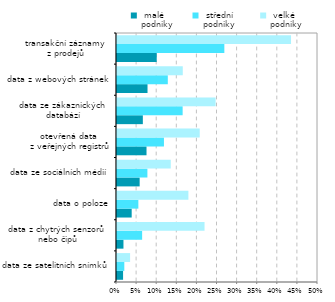
| Category |  malé 
podniky |  střední 
podniky |  velké 
podniky |
|---|---|---|---|
| data ze satelitních snímků | 0.015 | 0.018 | 0.033 |
| data z chytrých senzorů 
nebo čipů | 0.016 | 0.063 | 0.218 |
| data o poloze | 0.037 | 0.053 | 0.178 |
| data ze sociálních médií | 0.056 | 0.076 | 0.134 |
| otevřená data 
z veřejných registrů | 0.073 | 0.117 | 0.206 |
| data ze zákaznických 
databází | 0.064 | 0.163 | 0.245 |
| data z webových stránek | 0.076 | 0.126 | 0.164 |
| transakční záznamy 
z prodejů | 0.099 | 0.267 | 0.433 |